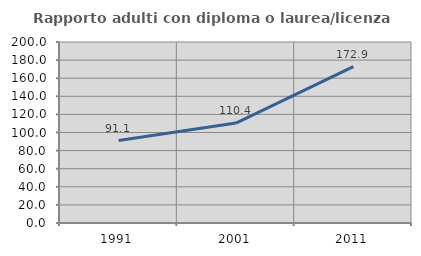
| Category | Rapporto adulti con diploma o laurea/licenza media  |
|---|---|
| 1991.0 | 91.052 |
| 2001.0 | 110.387 |
| 2011.0 | 172.88 |